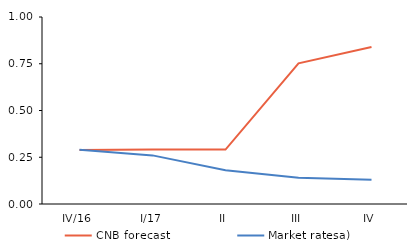
| Category | CNB forecast | Market ratesa) |
|---|---|---|
| IV/16 | 0.289 | 0.29 |
| I/17 | 0.291 | 0.26 |
| II | 0.291 | 0.18 |
| III | 0.752 | 0.14 |
| IV | 0.84 | 0.13 |